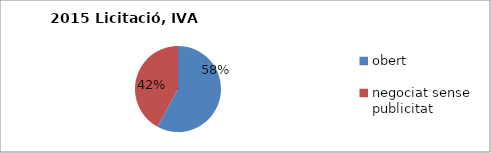
| Category | Series 0 | Series 1 |
|---|---|---|
| obert | 3857259.66 |  |
| negociat sense publicitat  | 2801973.91 |  |